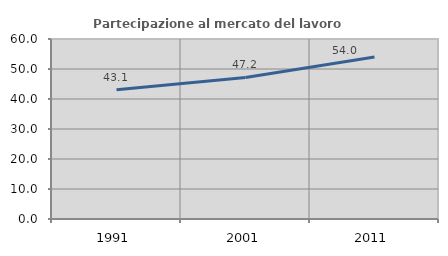
| Category | Partecipazione al mercato del lavoro  femminile |
|---|---|
| 1991.0 | 43.086 |
| 2001.0 | 47.187 |
| 2011.0 | 53.994 |